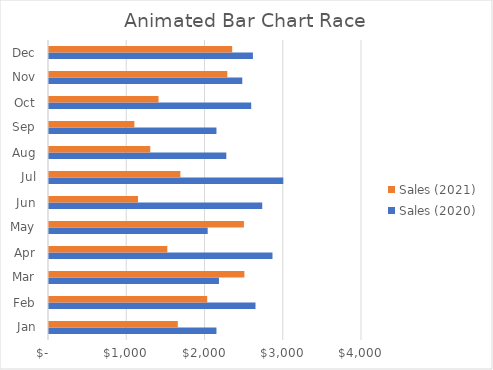
| Category | Sales (2020) | Sales (2021) |
|---|---|---|
| Jan | 2140 | 1646 |
| Feb | 2639 | 2022 |
| Mar | 2172 | 2497 |
| Apr | 2856 | 1512 |
| May | 2028 | 2491 |
| Jun | 2725 | 1138 |
| Jul | 2994 | 1679 |
| Aug | 2266 | 1294 |
| Sep | 2140 | 1091 |
| Oct | 2584 | 1400 |
| Nov | 2470 | 2279 |
| Dec | 2606 | 2341 |